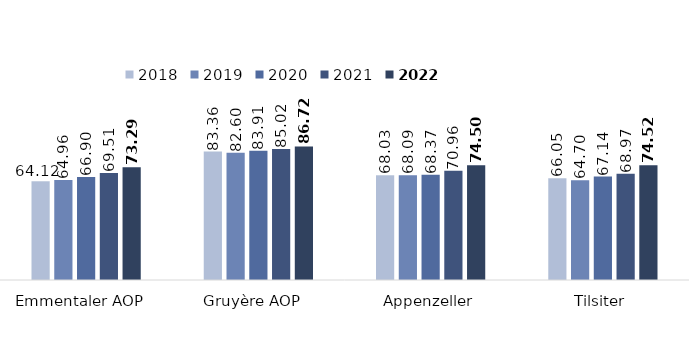
| Category | 2018 | 2019 | 2020 | 2021 | 2022 |
|---|---|---|---|---|---|
| Emmentaler AOP  | 64.121 | 64.958 | 66.901 | 69.506 | 73.287 |
| Gruyère AOP  | 83.362 | 82.598 | 83.914 | 85.021 | 86.723 |
| Appenzeller | 68.034 | 68.087 | 68.368 | 70.959 | 74.503 |
| Tilsiter | 66.053 | 64.698 | 67.143 | 68.975 | 74.517 |